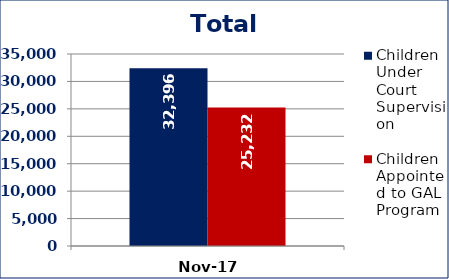
| Category | Children Under Court Supervision  | Children Appointed to GAL Program  |
|---|---|---|
| Nov-17 | 32396 | 25232 |